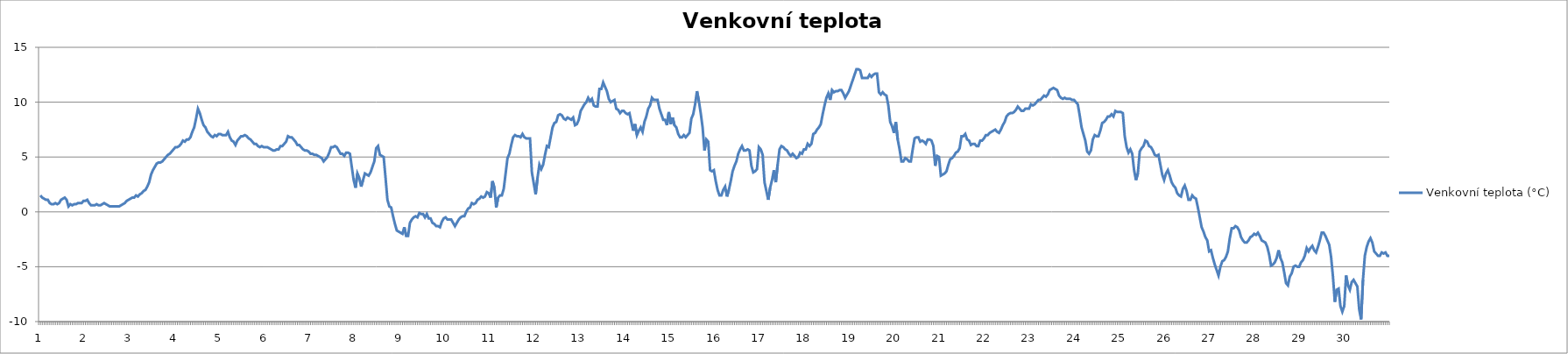
| Category | Venkovní teplota (°C) |
|---|---|
| 0 | 1.5 |
| 1 | 1.3 |
| 2 | 1.2 |
| 3 | 1.1 |
| 4 | 1.1 |
| 5 | 0.8 |
| 6 | 0.7 |
| 7 | 0.7 |
| 8 | 0.8 |
| 9 | 0.7 |
| 10 | 0.8 |
| 11 | 1.1 |
| 12 | 1.2 |
| 13 | 1.3 |
| 14 | 1.1 |
| 15 | 0.5 |
| 16 | 0.7 |
| 17 | 0.6 |
| 18 | 0.7 |
| 19 | 0.7 |
| 20 | 0.8 |
| 21 | 0.8 |
| 22 | 0.8 |
| 23 | 1 |
| 24 | 1 |
| 25 | 1.1 |
| 26 | 0.8 |
| 27 | 0.6 |
| 28 | 0.6 |
| 29 | 0.6 |
| 30 | 0.7 |
| 31 | 0.6 |
| 32 | 0.6 |
| 33 | 0.7 |
| 34 | 0.8 |
| 35 | 0.7 |
| 36 | 0.6 |
| 37 | 0.5 |
| 38 | 0.5 |
| 39 | 0.5 |
| 40 | 0.5 |
| 41 | 0.5 |
| 42 | 0.5 |
| 43 | 0.6 |
| 44 | 0.7 |
| 45 | 0.8 |
| 46 | 1 |
| 47 | 1.1 |
| 48 | 1.2 |
| 49 | 1.3 |
| 50 | 1.3 |
| 51 | 1.5 |
| 52 | 1.4 |
| 53 | 1.6 |
| 54 | 1.7 |
| 55 | 1.9 |
| 56 | 2 |
| 57 | 2.3 |
| 58 | 2.7 |
| 59 | 3.4 |
| 60 | 3.8 |
| 61 | 4.1 |
| 62 | 4.4 |
| 63 | 4.5 |
| 64 | 4.5 |
| 65 | 4.6 |
| 66 | 4.8 |
| 67 | 5 |
| 68 | 5.2 |
| 69 | 5.3 |
| 70 | 5.5 |
| 71 | 5.7 |
| 72 | 5.9 |
| 73 | 5.9 |
| 74 | 6 |
| 75 | 6.2 |
| 76 | 6.5 |
| 77 | 6.4 |
| 78 | 6.6 |
| 79 | 6.6 |
| 80 | 6.8 |
| 81 | 7.3 |
| 82 | 7.7 |
| 83 | 8.5 |
| 84 | 9.4 |
| 85 | 9 |
| 86 | 8.4 |
| 87 | 7.9 |
| 88 | 7.7 |
| 89 | 7.3 |
| 90 | 7.1 |
| 91 | 6.9 |
| 92 | 6.8 |
| 93 | 7 |
| 94 | 6.9 |
| 95 | 7.1 |
| 96 | 7.1 |
| 97 | 7 |
| 98 | 7 |
| 99 | 7 |
| 100 | 7.3 |
| 101 | 6.8 |
| 102 | 6.5 |
| 103 | 6.4 |
| 104 | 6.1 |
| 105 | 6.5 |
| 106 | 6.7 |
| 107 | 6.9 |
| 108 | 6.9 |
| 109 | 7 |
| 110 | 6.9 |
| 111 | 6.7 |
| 112 | 6.6 |
| 113 | 6.4 |
| 114 | 6.2 |
| 115 | 6.2 |
| 116 | 6 |
| 117 | 5.9 |
| 118 | 6 |
| 119 | 5.9 |
| 120 | 5.9 |
| 121 | 5.9 |
| 122 | 5.8 |
| 123 | 5.7 |
| 124 | 5.6 |
| 125 | 5.6 |
| 126 | 5.7 |
| 127 | 5.7 |
| 128 | 6 |
| 129 | 6 |
| 130 | 6.2 |
| 131 | 6.4 |
| 132 | 6.9 |
| 133 | 6.8 |
| 134 | 6.8 |
| 135 | 6.6 |
| 136 | 6.4 |
| 137 | 6.1 |
| 138 | 6.1 |
| 139 | 5.9 |
| 140 | 5.7 |
| 141 | 5.6 |
| 142 | 5.6 |
| 143 | 5.5 |
| 144 | 5.3 |
| 145 | 5.3 |
| 146 | 5.2 |
| 147 | 5.2 |
| 148 | 5.1 |
| 149 | 5 |
| 150 | 4.9 |
| 151 | 4.6 |
| 152 | 4.8 |
| 153 | 5 |
| 154 | 5.4 |
| 155 | 5.9 |
| 156 | 5.9 |
| 157 | 6 |
| 158 | 5.9 |
| 159 | 5.6 |
| 160 | 5.3 |
| 161 | 5.3 |
| 162 | 5.1 |
| 163 | 5.4 |
| 164 | 5.4 |
| 165 | 5.3 |
| 166 | 4.1 |
| 167 | 2.9 |
| 168 | 2.2 |
| 169 | 3.5 |
| 170 | 3.1 |
| 171 | 2.3 |
| 172 | 2.9 |
| 173 | 3.5 |
| 174 | 3.4 |
| 175 | 3.3 |
| 176 | 3.6 |
| 177 | 4.1 |
| 178 | 4.6 |
| 179 | 5.8 |
| 180 | 6 |
| 181 | 5.2 |
| 182 | 5.1 |
| 183 | 5 |
| 184 | 3.1 |
| 185 | 1.1 |
| 186 | 0.5 |
| 187 | 0.4 |
| 188 | -0.4 |
| 189 | -1.1 |
| 190 | -1.7 |
| 191 | -1.8 |
| 192 | -1.9 |
| 193 | -2 |
| 194 | -1.4 |
| 195 | -2.2 |
| 196 | -2.2 |
| 197 | -1 |
| 198 | -0.7 |
| 199 | -0.5 |
| 200 | -0.4 |
| 201 | -0.5 |
| 202 | -0.1 |
| 203 | -0.2 |
| 204 | -0.2 |
| 205 | -0.5 |
| 206 | -0.2 |
| 207 | -0.6 |
| 208 | -0.6 |
| 209 | -1 |
| 210 | -1.1 |
| 211 | -1.3 |
| 212 | -1.3 |
| 213 | -1.4 |
| 214 | -0.9 |
| 215 | -0.6 |
| 216 | -0.5 |
| 217 | -0.7 |
| 218 | -0.7 |
| 219 | -0.7 |
| 220 | -1 |
| 221 | -1.3 |
| 222 | -1 |
| 223 | -0.7 |
| 224 | -0.5 |
| 225 | -0.4 |
| 226 | -0.4 |
| 227 | 0 |
| 228 | 0.3 |
| 229 | 0.4 |
| 230 | 0.8 |
| 231 | 0.7 |
| 232 | 0.8 |
| 233 | 1.1 |
| 234 | 1.2 |
| 235 | 1.4 |
| 236 | 1.3 |
| 237 | 1.4 |
| 238 | 1.8 |
| 239 | 1.7 |
| 240 | 1.3 |
| 241 | 2.8 |
| 242 | 2.2 |
| 243 | 0.4 |
| 244 | 1.3 |
| 245 | 1.5 |
| 246 | 1.5 |
| 247 | 2.1 |
| 248 | 3.5 |
| 249 | 4.9 |
| 250 | 5.3 |
| 251 | 6.1 |
| 252 | 6.8 |
| 253 | 7 |
| 254 | 6.9 |
| 255 | 6.9 |
| 256 | 6.8 |
| 257 | 7.1 |
| 258 | 6.8 |
| 259 | 6.7 |
| 260 | 6.7 |
| 261 | 6.7 |
| 262 | 3.6 |
| 263 | 2.6 |
| 264 | 1.6 |
| 265 | 3.1 |
| 266 | 4.3 |
| 267 | 3.9 |
| 268 | 4.3 |
| 269 | 5.2 |
| 270 | 6 |
| 271 | 5.9 |
| 272 | 6.8 |
| 273 | 7.7 |
| 274 | 8.1 |
| 275 | 8.2 |
| 276 | 8.8 |
| 277 | 8.9 |
| 278 | 8.8 |
| 279 | 8.5 |
| 280 | 8.4 |
| 281 | 8.6 |
| 282 | 8.5 |
| 283 | 8.4 |
| 284 | 8.6 |
| 285 | 7.9 |
| 286 | 8 |
| 287 | 8.4 |
| 288 | 9.2 |
| 289 | 9.5 |
| 290 | 9.8 |
| 291 | 10 |
| 292 | 10.4 |
| 293 | 10.1 |
| 294 | 10.3 |
| 295 | 9.7 |
| 296 | 9.6 |
| 297 | 9.6 |
| 298 | 11.2 |
| 299 | 11.2 |
| 300 | 11.8 |
| 301 | 11.4 |
| 302 | 11 |
| 303 | 10.3 |
| 304 | 10 |
| 305 | 10.1 |
| 306 | 10.2 |
| 307 | 9.4 |
| 308 | 9.3 |
| 309 | 9 |
| 310 | 9.2 |
| 311 | 9.2 |
| 312 | 9 |
| 313 | 8.9 |
| 314 | 9 |
| 315 | 8.2 |
| 316 | 7.4 |
| 317 | 8 |
| 318 | 7 |
| 319 | 7.4 |
| 320 | 7.7 |
| 321 | 7.3 |
| 322 | 8.2 |
| 323 | 8.7 |
| 324 | 9.4 |
| 325 | 9.7 |
| 326 | 10.4 |
| 327 | 10.2 |
| 328 | 10.2 |
| 329 | 10.2 |
| 330 | 9.4 |
| 331 | 8.9 |
| 332 | 8.4 |
| 333 | 8.4 |
| 334 | 7.9 |
| 335 | 9.1 |
| 336 | 8 |
| 337 | 8.6 |
| 338 | 7.9 |
| 339 | 7.7 |
| 340 | 7.1 |
| 341 | 6.8 |
| 342 | 6.8 |
| 343 | 7 |
| 344 | 6.8 |
| 345 | 7 |
| 346 | 7.2 |
| 347 | 8.5 |
| 348 | 8.9 |
| 349 | 9.8 |
| 350 | 11 |
| 351 | 10.1 |
| 352 | 9 |
| 353 | 7.7 |
| 354 | 5.6 |
| 355 | 6.6 |
| 356 | 6.4 |
| 357 | 3.8 |
| 358 | 3.7 |
| 359 | 3.8 |
| 360 | 2.8 |
| 361 | 2 |
| 362 | 1.5 |
| 363 | 1.5 |
| 364 | 2 |
| 365 | 2.3 |
| 366 | 1.4 |
| 367 | 2 |
| 368 | 2.8 |
| 369 | 3.7 |
| 370 | 4.2 |
| 371 | 4.6 |
| 372 | 5.3 |
| 373 | 5.7 |
| 374 | 6 |
| 375 | 5.6 |
| 376 | 5.6 |
| 377 | 5.7 |
| 378 | 5.6 |
| 379 | 4.2 |
| 380 | 3.6 |
| 381 | 3.7 |
| 382 | 3.9 |
| 383 | 5.9 |
| 384 | 5.7 |
| 385 | 5.2 |
| 386 | 2.7 |
| 387 | 1.9 |
| 388 | 1.1 |
| 389 | 2.2 |
| 390 | 2.9 |
| 391 | 3.8 |
| 392 | 2.7 |
| 393 | 4.3 |
| 394 | 5.7 |
| 395 | 6 |
| 396 | 5.9 |
| 397 | 5.7 |
| 398 | 5.6 |
| 399 | 5.3 |
| 400 | 5.1 |
| 401 | 5.3 |
| 402 | 5.1 |
| 403 | 4.9 |
| 404 | 5 |
| 405 | 5.4 |
| 406 | 5.3 |
| 407 | 5.7 |
| 408 | 5.7 |
| 409 | 6.2 |
| 410 | 6 |
| 411 | 6.2 |
| 412 | 7.1 |
| 413 | 7.2 |
| 414 | 7.5 |
| 415 | 7.7 |
| 416 | 8 |
| 417 | 8.9 |
| 418 | 9.7 |
| 419 | 10.4 |
| 420 | 10.8 |
| 421 | 10.2 |
| 422 | 11.1 |
| 423 | 10.9 |
| 424 | 11 |
| 425 | 11 |
| 426 | 11.1 |
| 427 | 11.1 |
| 428 | 10.8 |
| 429 | 10.4 |
| 430 | 10.7 |
| 431 | 11 |
| 432 | 11.5 |
| 433 | 12 |
| 434 | 12.5 |
| 435 | 13 |
| 436 | 13 |
| 437 | 12.9 |
| 438 | 12.2 |
| 439 | 12.2 |
| 440 | 12.2 |
| 441 | 12.2 |
| 442 | 12.5 |
| 443 | 12.3 |
| 444 | 12.5 |
| 445 | 12.6 |
| 446 | 12.6 |
| 447 | 10.9 |
| 448 | 10.7 |
| 449 | 10.9 |
| 450 | 10.7 |
| 451 | 10.6 |
| 452 | 9.7 |
| 453 | 8.2 |
| 454 | 7.8 |
| 455 | 7.2 |
| 456 | 8.2 |
| 457 | 6.6 |
| 458 | 5.7 |
| 459 | 4.6 |
| 460 | 4.6 |
| 461 | 4.9 |
| 462 | 4.8 |
| 463 | 4.6 |
| 464 | 4.6 |
| 465 | 5.7 |
| 466 | 6.7 |
| 467 | 6.8 |
| 468 | 6.8 |
| 469 | 6.4 |
| 470 | 6.5 |
| 471 | 6.4 |
| 472 | 6.2 |
| 473 | 6.6 |
| 474 | 6.6 |
| 475 | 6.5 |
| 476 | 6 |
| 477 | 4.2 |
| 478 | 5.1 |
| 479 | 5 |
| 480 | 3.3 |
| 481 | 3.4 |
| 482 | 3.5 |
| 483 | 3.7 |
| 484 | 4.3 |
| 485 | 4.8 |
| 486 | 4.9 |
| 487 | 5.1 |
| 488 | 5.4 |
| 489 | 5.5 |
| 490 | 5.8 |
| 491 | 6.9 |
| 492 | 6.9 |
| 493 | 7.1 |
| 494 | 6.6 |
| 495 | 6.5 |
| 496 | 6.1 |
| 497 | 6.2 |
| 498 | 6.2 |
| 499 | 6 |
| 500 | 6 |
| 501 | 6.5 |
| 502 | 6.5 |
| 503 | 6.7 |
| 504 | 7 |
| 505 | 7 |
| 506 | 7.2 |
| 507 | 7.3 |
| 508 | 7.4 |
| 509 | 7.5 |
| 510 | 7.3 |
| 511 | 7.2 |
| 512 | 7.5 |
| 513 | 7.9 |
| 514 | 8.2 |
| 515 | 8.7 |
| 516 | 8.9 |
| 517 | 9 |
| 518 | 9 |
| 519 | 9.1 |
| 520 | 9.3 |
| 521 | 9.6 |
| 522 | 9.4 |
| 523 | 9.2 |
| 524 | 9.2 |
| 525 | 9.4 |
| 526 | 9.4 |
| 527 | 9.4 |
| 528 | 9.8 |
| 529 | 9.7 |
| 530 | 9.8 |
| 531 | 10 |
| 532 | 10.2 |
| 533 | 10.2 |
| 534 | 10.4 |
| 535 | 10.6 |
| 536 | 10.5 |
| 537 | 10.7 |
| 538 | 11.1 |
| 539 | 11.2 |
| 540 | 11.3 |
| 541 | 11.2 |
| 542 | 11.1 |
| 543 | 10.6 |
| 544 | 10.4 |
| 545 | 10.3 |
| 546 | 10.4 |
| 547 | 10.3 |
| 548 | 10.3 |
| 549 | 10.3 |
| 550 | 10.2 |
| 551 | 10.2 |
| 552 | 10 |
| 553 | 9.8 |
| 554 | 8.8 |
| 555 | 7.7 |
| 556 | 7.1 |
| 557 | 6.5 |
| 558 | 5.5 |
| 559 | 5.3 |
| 560 | 5.6 |
| 561 | 6.6 |
| 562 | 7 |
| 563 | 6.9 |
| 564 | 6.9 |
| 565 | 7.4 |
| 566 | 8.1 |
| 567 | 8.2 |
| 568 | 8.4 |
| 569 | 8.7 |
| 570 | 8.7 |
| 571 | 8.9 |
| 572 | 8.7 |
| 573 | 9.2 |
| 574 | 9.1 |
| 575 | 9.1 |
| 576 | 9.1 |
| 577 | 9 |
| 578 | 6.9 |
| 579 | 5.9 |
| 580 | 5.4 |
| 581 | 5.7 |
| 582 | 5.3 |
| 583 | 3.8 |
| 584 | 2.9 |
| 585 | 3.5 |
| 586 | 5.5 |
| 587 | 5.8 |
| 588 | 6 |
| 589 | 6.5 |
| 590 | 6.4 |
| 591 | 6 |
| 592 | 5.9 |
| 593 | 5.6 |
| 594 | 5.2 |
| 595 | 5.1 |
| 596 | 5.2 |
| 597 | 4.3 |
| 598 | 3.4 |
| 599 | 2.9 |
| 600 | 3.5 |
| 601 | 3.8 |
| 602 | 3.3 |
| 603 | 2.7 |
| 604 | 2.4 |
| 605 | 2.2 |
| 606 | 1.7 |
| 607 | 1.5 |
| 608 | 1.4 |
| 609 | 2.1 |
| 610 | 2.4 |
| 611 | 1.9 |
| 612 | 1.1 |
| 613 | 1.1 |
| 614 | 1.5 |
| 615 | 1.3 |
| 616 | 1.2 |
| 617 | 0.4 |
| 618 | -0.5 |
| 619 | -1.4 |
| 620 | -1.8 |
| 621 | -2.3 |
| 622 | -2.6 |
| 623 | -3.6 |
| 624 | -3.5 |
| 625 | -4.2 |
| 626 | -4.8 |
| 627 | -5.3 |
| 628 | -5.8 |
| 629 | -5 |
| 630 | -4.5 |
| 631 | -4.4 |
| 632 | -4.1 |
| 633 | -3.6 |
| 634 | -2.4 |
| 635 | -1.5 |
| 636 | -1.5 |
| 637 | -1.3 |
| 638 | -1.4 |
| 639 | -1.7 |
| 640 | -2.3 |
| 641 | -2.6 |
| 642 | -2.8 |
| 643 | -2.8 |
| 644 | -2.6 |
| 645 | -2.3 |
| 646 | -2.2 |
| 647 | -2 |
| 648 | -2.1 |
| 649 | -1.9 |
| 650 | -2.2 |
| 651 | -2.6 |
| 652 | -2.7 |
| 653 | -2.8 |
| 654 | -3.2 |
| 655 | -3.9 |
| 656 | -4.9 |
| 657 | -4.8 |
| 658 | -4.6 |
| 659 | -4.2 |
| 660 | -3.5 |
| 661 | -4.2 |
| 662 | -4.6 |
| 663 | -5.5 |
| 664 | -6.5 |
| 665 | -6.7 |
| 666 | -5.9 |
| 667 | -5.6 |
| 668 | -5 |
| 669 | -4.9 |
| 670 | -5 |
| 671 | -5 |
| 672 | -4.6 |
| 673 | -4.4 |
| 674 | -4 |
| 675 | -3.3 |
| 676 | -3.6 |
| 677 | -3.3 |
| 678 | -3.1 |
| 679 | -3.5 |
| 680 | -3.7 |
| 681 | -3.2 |
| 682 | -2.6 |
| 683 | -1.9 |
| 684 | -1.9 |
| 685 | -2.2 |
| 686 | -2.6 |
| 687 | -3 |
| 688 | -4.1 |
| 689 | -5.9 |
| 690 | -8.2 |
| 691 | -7.1 |
| 692 | -7 |
| 693 | -8.6 |
| 694 | -9.1 |
| 695 | -8.6 |
| 696 | -5.8 |
| 697 | -6.7 |
| 698 | -7.1 |
| 699 | -6.4 |
| 700 | -6.2 |
| 701 | -6.5 |
| 702 | -6.8 |
| 703 | -8.9 |
| 704 | -9.8 |
| 705 | -6.2 |
| 706 | -4 |
| 707 | -3.2 |
| 708 | -2.7 |
| 709 | -2.4 |
| 710 | -2.8 |
| 711 | -3.6 |
| 712 | -3.8 |
| 713 | -4 |
| 714 | -4 |
| 715 | -3.7 |
| 716 | -3.8 |
| 717 | -3.7 |
| 718 | -4 |
| 719 | -4 |